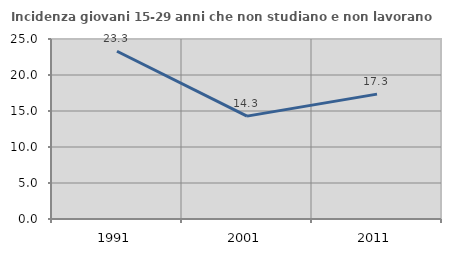
| Category | Incidenza giovani 15-29 anni che non studiano e non lavorano  |
|---|---|
| 1991.0 | 23.301 |
| 2001.0 | 14.286 |
| 2011.0 | 17.341 |